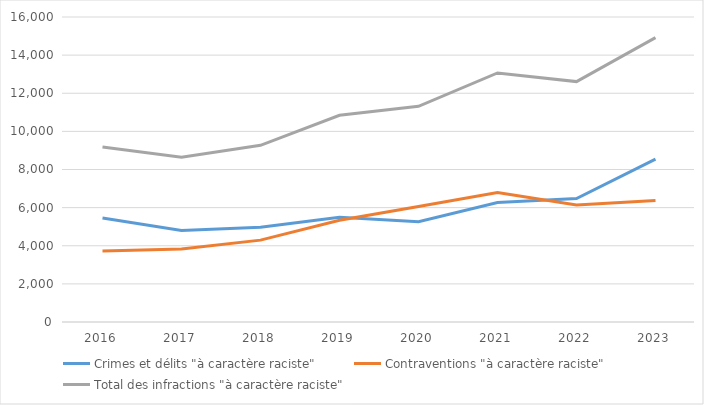
| Category | Crimes et délits "à caractère raciste" | Contraventions "à caractère raciste" | Total des infractions "à caractère raciste" |
|---|---|---|---|
| 2016.0 | 5460 | 3725 | 9185 |
| 2017.0 | 4806 | 3831 | 8637 |
| 2018.0 | 4972 | 4295 | 9267 |
| 2019.0 | 5501 | 5341 | 10842 |
| 2020.0 | 5255 | 6057 | 11312 |
| 2021.0 | 6267 | 6797 | 13064 |
| 2022.0 | 6478 | 6134 | 12612 |
| 2023.0 | 8542 | 6376 | 14918 |